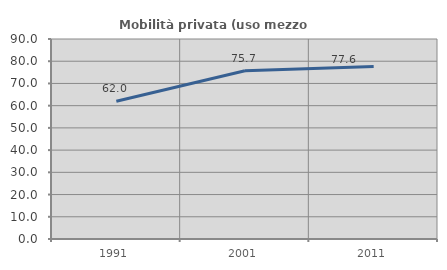
| Category | Mobilità privata (uso mezzo privato) |
|---|---|
| 1991.0 | 61.974 |
| 2001.0 | 75.705 |
| 2011.0 | 77.63 |